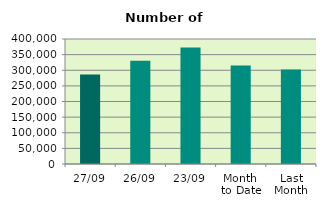
| Category | Series 0 |
|---|---|
| 27/09 | 286018 |
| 26/09 | 330782 |
| 23/09 | 372652 |
| Month 
to Date | 315180.947 |
| Last
Month | 302693.565 |